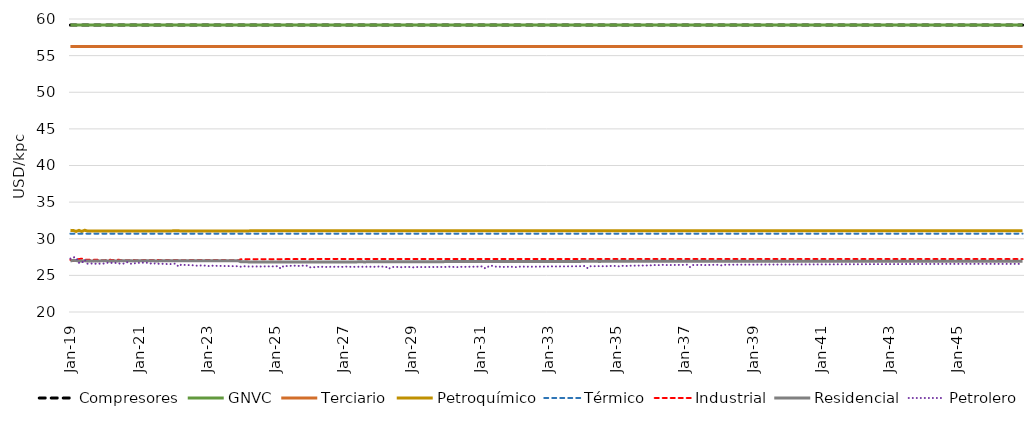
| Category | Compresores | GNVC | Terciario | Petroquímico | Térmico | Industrial | Residencial | Petrolero |
|---|---|---|---|---|---|---|---|---|
| 2019-01-01 | 59.17 | 59.17 | 56.248 | 31.146 | 30.695 | 27.109 | 26.962 | 27.287 |
| 2019-02-01 | 59.17 | 59.17 | 56.248 | 31.127 | 30.695 | 26.976 | 27.054 | 27.488 |
| 2019-03-01 | 59.17 | 59.17 | 56.248 | 31.003 | 30.695 | 27.119 | 27.032 | 27.428 |
| 2019-04-01 | 59.17 | 59.17 | 56.248 | 31.146 | 30.695 | 27.227 | 26.945 | 26.718 |
| 2019-05-01 | 59.17 | 59.17 | 56.248 | 30.996 | 30.695 | 27.282 | 26.962 | 26.695 |
| 2019-06-01 | 59.17 | 59.17 | 56.248 | 31.163 | 30.695 | 27.152 | 26.989 | 27.141 |
| 2019-07-01 | 59.17 | 59.17 | 56.248 | 31.062 | 30.695 | 27.127 | 26.961 | 26.597 |
| 2019-08-01 | 59.17 | 59.17 | 56.248 | 31.062 | 30.695 | 27.127 | 26.961 | 26.595 |
| 2019-09-01 | 59.17 | 59.17 | 56.248 | 31.062 | 30.695 | 27.127 | 26.961 | 26.641 |
| 2019-10-01 | 59.17 | 59.17 | 56.248 | 31.062 | 30.695 | 27.121 | 26.965 | 26.577 |
| 2019-11-01 | 59.17 | 59.17 | 56.248 | 31.062 | 30.695 | 27.124 | 26.963 | 26.599 |
| 2019-12-01 | 59.17 | 59.17 | 56.248 | 31.062 | 30.695 | 27.072 | 26.991 | 26.592 |
| 2020-01-01 | 59.17 | 59.17 | 56.248 | 31.062 | 30.695 | 27.078 | 26.988 | 26.64 |
| 2020-02-01 | 59.17 | 59.17 | 56.248 | 31.062 | 30.695 | 27.1 | 26.978 | 26.725 |
| 2020-03-01 | 59.17 | 59.17 | 56.248 | 31.062 | 30.695 | 27.127 | 26.961 | 26.698 |
| 2020-04-01 | 59.17 | 59.17 | 56.248 | 31.062 | 30.695 | 27.09 | 26.981 | 26.703 |
| 2020-05-01 | 59.17 | 59.17 | 56.248 | 31.062 | 30.695 | 27.121 | 26.964 | 26.69 |
| 2020-06-01 | 59.17 | 59.17 | 56.248 | 31.062 | 30.695 | 27.127 | 26.961 | 26.617 |
| 2020-07-01 | 59.17 | 59.17 | 56.248 | 31.062 | 30.695 | 27.076 | 27.005 | 26.605 |
| 2020-08-01 | 59.17 | 59.17 | 56.248 | 31.062 | 30.695 | 27.076 | 27.004 | 26.614 |
| 2020-09-01 | 59.17 | 59.17 | 56.248 | 31.062 | 30.695 | 27.064 | 27.006 | 26.788 |
| 2020-10-01 | 59.17 | 59.17 | 56.248 | 31.062 | 30.695 | 27.064 | 27.003 | 26.6 |
| 2020-11-01 | 59.17 | 59.17 | 56.248 | 31.062 | 30.695 | 27.101 | 26.975 | 26.574 |
| 2020-12-01 | 59.17 | 59.17 | 56.248 | 31.062 | 30.695 | 27.076 | 27.003 | 26.685 |
| 2021-01-01 | 59.17 | 59.17 | 56.248 | 31.062 | 30.695 | 27.079 | 26.992 | 26.707 |
| 2021-02-01 | 59.17 | 59.17 | 56.248 | 31.062 | 30.695 | 27.077 | 26.993 | 26.742 |
| 2021-03-01 | 59.17 | 59.17 | 56.248 | 31.062 | 30.695 | 27.089 | 26.985 | 26.734 |
| 2021-04-01 | 59.17 | 59.17 | 56.248 | 31.062 | 30.695 | 27.085 | 26.988 | 26.724 |
| 2021-05-01 | 59.17 | 59.17 | 56.248 | 31.062 | 30.695 | 27.087 | 26.987 | 26.598 |
| 2021-06-01 | 59.17 | 59.17 | 56.248 | 31.062 | 30.695 | 27.082 | 26.99 | 26.704 |
| 2021-07-01 | 59.17 | 59.17 | 56.248 | 31.062 | 30.695 | 27.101 | 26.978 | 26.591 |
| 2021-08-01 | 59.17 | 59.17 | 56.248 | 31.062 | 30.695 | 27.102 | 26.977 | 26.585 |
| 2021-09-01 | 59.17 | 59.17 | 56.248 | 31.062 | 30.695 | 27.078 | 26.992 | 26.572 |
| 2021-10-01 | 59.17 | 59.17 | 56.248 | 31.064 | 30.695 | 27.071 | 27.004 | 26.595 |
| 2021-11-01 | 59.17 | 59.17 | 56.248 | 31.062 | 30.695 | 27.087 | 26.986 | 26.539 |
| 2021-12-01 | 59.17 | 59.17 | 56.248 | 31.062 | 30.695 | 27.078 | 26.992 | 26.533 |
| 2022-01-01 | 59.17 | 59.17 | 56.248 | 31.078 | 30.695 | 27.088 | 26.987 | 26.587 |
| 2022-02-01 | 59.17 | 59.17 | 56.248 | 31.076 | 30.695 | 27.085 | 26.99 | 26.612 |
| 2022-03-01 | 59.17 | 59.17 | 56.248 | 31.078 | 30.695 | 27.089 | 26.986 | 26.198 |
| 2022-04-01 | 59.17 | 59.17 | 56.248 | 31.069 | 30.695 | 27.077 | 26.998 | 26.482 |
| 2022-05-01 | 59.17 | 59.17 | 56.248 | 31.062 | 30.695 | 27.064 | 27.009 | 26.43 |
| 2022-06-01 | 59.17 | 59.17 | 56.248 | 31.062 | 30.695 | 27.065 | 27.008 | 26.409 |
| 2022-07-01 | 59.17 | 59.17 | 56.248 | 31.062 | 30.695 | 27.091 | 26.986 | 26.398 |
| 2022-08-01 | 59.17 | 59.17 | 56.248 | 31.062 | 30.695 | 27.091 | 26.987 | 26.378 |
| 2022-09-01 | 59.17 | 59.17 | 56.248 | 31.062 | 30.695 | 27.089 | 26.987 | 26.315 |
| 2022-10-01 | 59.17 | 59.17 | 56.248 | 31.062 | 30.695 | 27.091 | 26.987 | 26.339 |
| 2022-11-01 | 59.17 | 59.17 | 56.248 | 31.062 | 30.695 | 27.09 | 26.988 | 26.353 |
| 2022-12-01 | 59.17 | 59.17 | 56.248 | 31.062 | 30.695 | 27.091 | 26.987 | 26.337 |
| 2023-01-01 | 59.17 | 59.17 | 56.248 | 31.062 | 30.695 | 27.091 | 26.987 | 26.338 |
| 2023-02-01 | 59.17 | 59.17 | 56.248 | 31.062 | 30.695 | 27.09 | 26.988 | 26.239 |
| 2023-03-01 | 59.17 | 59.17 | 56.248 | 31.062 | 30.695 | 27.091 | 26.987 | 26.317 |
| 2023-04-01 | 59.17 | 59.17 | 56.248 | 31.062 | 30.695 | 27.09 | 26.988 | 26.304 |
| 2023-05-01 | 59.17 | 59.17 | 56.248 | 31.062 | 30.695 | 27.09 | 26.988 | 26.302 |
| 2023-06-01 | 59.17 | 59.17 | 56.248 | 31.062 | 30.695 | 27.084 | 26.997 | 26.29 |
| 2023-07-01 | 59.17 | 59.17 | 56.248 | 31.062 | 30.695 | 27.09 | 26.99 | 26.276 |
| 2023-08-01 | 59.17 | 59.17 | 56.248 | 31.062 | 30.695 | 27.076 | 27.002 | 26.277 |
| 2023-09-01 | 59.17 | 59.17 | 56.248 | 31.062 | 30.695 | 27.065 | 27.008 | 26.27 |
| 2023-10-01 | 59.17 | 59.17 | 56.248 | 31.062 | 30.695 | 27.065 | 27.008 | 26.26 |
| 2023-11-01 | 59.17 | 59.17 | 56.248 | 31.062 | 30.695 | 27.068 | 27.007 | 26.249 |
| 2023-12-01 | 59.17 | 59.17 | 56.248 | 31.062 | 30.695 | 27.067 | 27.007 | 26.253 |
| 2024-01-01 | 59.17 | 59.17 | 56.248 | 31.067 | 30.695 | 27.197 | 26.848 | 26.181 |
| 2024-02-01 | 59.17 | 59.17 | 56.248 | 31.072 | 30.695 | 27.203 | 26.843 | 26.26 |
| 2024-03-01 | 59.17 | 59.17 | 56.248 | 31.07 | 30.695 | 27.199 | 26.846 | 26.204 |
| 2024-04-01 | 59.17 | 59.17 | 56.248 | 31.075 | 30.695 | 27.207 | 26.838 | 26.214 |
| 2024-05-01 | 59.17 | 59.17 | 56.248 | 31.076 | 30.695 | 27.208 | 26.837 | 26.215 |
| 2024-06-01 | 59.17 | 59.17 | 56.248 | 31.077 | 30.695 | 27.209 | 26.835 | 26.214 |
| 2024-07-01 | 59.17 | 59.17 | 56.248 | 31.082 | 30.695 | 27.214 | 26.83 | 26.223 |
| 2024-08-01 | 59.17 | 59.17 | 56.248 | 31.081 | 30.695 | 27.214 | 26.831 | 26.211 |
| 2024-09-01 | 59.17 | 59.17 | 56.248 | 31.085 | 30.695 | 27.217 | 26.827 | 26.225 |
| 2024-10-01 | 59.17 | 59.17 | 56.248 | 31.086 | 30.695 | 27.217 | 26.826 | 26.227 |
| 2024-11-01 | 59.17 | 59.17 | 56.248 | 31.086 | 30.695 | 27.218 | 26.825 | 26.23 |
| 2024-12-01 | 59.17 | 59.17 | 56.248 | 31.086 | 30.695 | 27.218 | 26.826 | 26.232 |
| 2025-01-01 | 59.17 | 59.17 | 56.248 | 31.086 | 30.695 | 27.202 | 26.829 | 26.217 |
| 2025-02-01 | 59.17 | 59.17 | 56.248 | 31.087 | 30.695 | 27.216 | 26.822 | 26.267 |
| 2025-03-01 | 59.17 | 59.17 | 56.248 | 31.087 | 30.695 | 27.216 | 26.823 | 25.92 |
| 2025-04-01 | 59.17 | 59.17 | 56.248 | 31.088 | 30.695 | 27.218 | 26.822 | 26.3 |
| 2025-05-01 | 59.17 | 59.17 | 56.248 | 31.09 | 30.695 | 27.22 | 26.823 | 26.272 |
| 2025-06-01 | 59.17 | 59.17 | 56.248 | 31.09 | 30.695 | 27.22 | 26.82 | 26.296 |
| 2025-07-01 | 59.17 | 59.17 | 56.248 | 31.091 | 30.695 | 27.221 | 26.822 | 26.31 |
| 2025-08-01 | 59.17 | 59.17 | 56.248 | 31.092 | 30.695 | 27.221 | 26.821 | 26.322 |
| 2025-09-01 | 59.17 | 59.17 | 56.248 | 31.092 | 30.695 | 27.225 | 26.821 | 26.275 |
| 2025-10-01 | 59.17 | 59.17 | 56.248 | 31.092 | 30.695 | 27.226 | 26.82 | 26.324 |
| 2025-11-01 | 59.17 | 59.17 | 56.248 | 31.092 | 30.695 | 27.228 | 26.821 | 26.327 |
| 2025-12-01 | 59.17 | 59.17 | 56.248 | 31.093 | 30.695 | 27.228 | 26.822 | 26.349 |
| 2026-01-01 | 59.17 | 59.17 | 56.248 | 31.09 | 30.695 | 27.202 | 26.838 | 26.111 |
| 2026-02-01 | 59.17 | 59.17 | 56.248 | 31.09 | 30.695 | 27.233 | 26.817 | 26.083 |
| 2026-03-01 | 59.17 | 59.17 | 56.248 | 31.09 | 30.695 | 27.233 | 26.818 | 26.132 |
| 2026-04-01 | 59.17 | 59.17 | 56.248 | 31.091 | 30.695 | 27.235 | 26.819 | 26.149 |
| 2026-05-01 | 59.17 | 59.17 | 56.248 | 31.09 | 30.695 | 27.236 | 26.818 | 26.208 |
| 2026-06-01 | 59.17 | 59.17 | 56.248 | 31.09 | 30.695 | 27.239 | 26.816 | 26.156 |
| 2026-07-01 | 59.17 | 59.17 | 56.248 | 31.091 | 30.695 | 27.238 | 26.819 | 26.149 |
| 2026-08-01 | 59.17 | 59.17 | 56.248 | 31.091 | 30.695 | 27.24 | 26.818 | 26.159 |
| 2026-09-01 | 59.17 | 59.17 | 56.248 | 31.091 | 30.695 | 27.243 | 26.817 | 26.173 |
| 2026-10-01 | 59.17 | 59.17 | 56.248 | 31.091 | 30.695 | 27.243 | 26.817 | 26.169 |
| 2026-11-01 | 59.17 | 59.17 | 56.248 | 31.091 | 30.695 | 27.246 | 26.815 | 26.175 |
| 2026-12-01 | 59.17 | 59.17 | 56.248 | 31.091 | 30.695 | 27.245 | 26.816 | 26.173 |
| 2027-01-01 | 59.17 | 59.17 | 56.248 | 31.09 | 30.695 | 27.223 | 26.838 | 26.155 |
| 2027-02-01 | 59.17 | 59.17 | 56.248 | 31.09 | 30.695 | 27.227 | 26.837 | 26.197 |
| 2027-03-01 | 59.17 | 59.17 | 56.248 | 31.09 | 30.695 | 27.225 | 26.837 | 26.159 |
| 2027-04-01 | 59.17 | 59.17 | 56.248 | 31.089 | 30.695 | 27.228 | 26.838 | 26.171 |
| 2027-05-01 | 59.17 | 59.17 | 56.248 | 31.09 | 30.695 | 27.23 | 26.837 | 26.169 |
| 2027-06-01 | 59.17 | 59.17 | 56.248 | 31.085 | 30.695 | 27.224 | 26.843 | 26.18 |
| 2027-07-01 | 59.17 | 59.17 | 56.248 | 31.085 | 30.695 | 27.222 | 26.843 | 26.167 |
| 2027-08-01 | 59.17 | 59.17 | 56.248 | 31.085 | 30.695 | 27.224 | 26.843 | 26.177 |
| 2027-09-01 | 59.17 | 59.17 | 56.248 | 31.085 | 30.695 | 27.227 | 26.843 | 26.182 |
| 2027-10-01 | 59.17 | 59.17 | 56.248 | 31.085 | 30.695 | 27.227 | 26.86 | 26.181 |
| 2027-11-01 | 59.17 | 59.17 | 56.248 | 31.085 | 30.695 | 27.227 | 26.862 | 26.173 |
| 2027-12-01 | 59.17 | 59.17 | 56.248 | 31.085 | 30.695 | 27.227 | 26.861 | 26.17 |
| 2028-01-01 | 59.17 | 59.17 | 56.248 | 31.091 | 30.695 | 27.235 | 26.856 | 26.178 |
| 2028-02-01 | 59.17 | 59.17 | 56.248 | 31.091 | 30.695 | 27.233 | 26.858 | 26.236 |
| 2028-03-01 | 59.17 | 59.17 | 56.248 | 31.091 | 30.695 | 27.23 | 26.855 | 26.185 |
| 2028-04-01 | 59.17 | 59.17 | 56.248 | 31.091 | 30.695 | 27.234 | 26.846 | 26.18 |
| 2028-05-01 | 59.17 | 59.17 | 56.248 | 31.091 | 30.695 | 27.233 | 26.843 | 25.894 |
| 2028-06-01 | 59.17 | 59.17 | 56.248 | 31.091 | 30.695 | 27.232 | 26.846 | 26.152 |
| 2028-07-01 | 59.17 | 59.17 | 56.248 | 31.091 | 30.695 | 27.231 | 26.86 | 26.15 |
| 2028-08-01 | 59.17 | 59.17 | 56.248 | 31.091 | 30.695 | 27.23 | 26.861 | 26.144 |
| 2028-09-01 | 59.17 | 59.17 | 56.248 | 31.091 | 30.695 | 27.23 | 26.863 | 26.1 |
| 2028-10-01 | 59.17 | 59.17 | 56.248 | 31.091 | 30.695 | 27.23 | 26.863 | 26.151 |
| 2028-11-01 | 59.17 | 59.17 | 56.248 | 31.091 | 30.695 | 27.23 | 26.865 | 26.148 |
| 2028-12-01 | 59.17 | 59.17 | 56.248 | 31.091 | 30.695 | 27.23 | 26.864 | 26.147 |
| 2029-01-01 | 59.17 | 59.17 | 56.248 | 31.091 | 30.695 | 27.231 | 26.866 | 26.139 |
| 2029-02-01 | 59.17 | 59.17 | 56.248 | 31.091 | 30.695 | 27.229 | 26.87 | 26.073 |
| 2029-03-01 | 59.17 | 59.17 | 56.248 | 31.091 | 30.695 | 27.229 | 26.869 | 26.138 |
| 2029-04-01 | 59.17 | 59.17 | 56.248 | 31.091 | 30.695 | 27.229 | 26.871 | 26.138 |
| 2029-05-01 | 59.17 | 59.17 | 56.248 | 31.091 | 30.695 | 27.229 | 26.87 | 26.142 |
| 2029-06-01 | 59.17 | 59.17 | 56.248 | 31.091 | 30.695 | 27.229 | 26.873 | 26.143 |
| 2029-07-01 | 59.17 | 59.17 | 56.248 | 31.091 | 30.695 | 27.229 | 26.873 | 26.143 |
| 2029-08-01 | 59.17 | 59.17 | 56.248 | 31.091 | 30.695 | 27.229 | 26.872 | 26.142 |
| 2029-09-01 | 59.17 | 59.17 | 56.248 | 31.091 | 30.695 | 27.229 | 26.875 | 26.146 |
| 2029-10-01 | 59.17 | 59.17 | 56.248 | 31.091 | 30.695 | 27.229 | 26.875 | 26.147 |
| 2029-11-01 | 59.17 | 59.17 | 56.248 | 31.091 | 30.695 | 27.228 | 26.876 | 26.147 |
| 2029-12-01 | 59.17 | 59.17 | 56.248 | 31.091 | 30.695 | 27.228 | 26.876 | 26.15 |
| 2030-01-01 | 59.17 | 59.17 | 56.248 | 31.091 | 30.695 | 27.229 | 26.878 | 26.15 |
| 2030-02-01 | 59.17 | 59.17 | 56.248 | 31.091 | 30.695 | 27.228 | 26.88 | 26.192 |
| 2030-03-01 | 59.17 | 59.17 | 56.248 | 31.091 | 30.695 | 27.228 | 26.882 | 26.156 |
| 2030-04-01 | 59.17 | 59.17 | 56.248 | 31.091 | 30.695 | 27.228 | 26.881 | 26.159 |
| 2030-05-01 | 59.17 | 59.17 | 56.248 | 31.091 | 30.695 | 27.228 | 26.881 | 26.122 |
| 2030-06-01 | 59.17 | 59.17 | 56.248 | 31.091 | 30.695 | 27.228 | 26.884 | 26.165 |
| 2030-07-01 | 59.17 | 59.17 | 56.248 | 31.091 | 30.695 | 27.228 | 26.883 | 26.165 |
| 2030-08-01 | 59.17 | 59.17 | 56.248 | 31.091 | 30.695 | 27.227 | 26.884 | 26.168 |
| 2030-09-01 | 59.17 | 59.17 | 56.248 | 31.091 | 30.695 | 27.228 | 26.884 | 26.171 |
| 2030-10-01 | 59.17 | 59.17 | 56.248 | 31.091 | 30.695 | 27.227 | 26.885 | 26.177 |
| 2030-11-01 | 59.17 | 59.17 | 56.248 | 31.091 | 30.695 | 27.227 | 26.887 | 26.186 |
| 2030-12-01 | 59.17 | 59.17 | 56.248 | 31.091 | 30.695 | 27.227 | 26.886 | 26.188 |
| 2031-01-01 | 59.17 | 59.17 | 56.248 | 31.091 | 30.695 | 27.228 | 26.894 | 26.201 |
| 2031-02-01 | 59.17 | 59.17 | 56.248 | 31.091 | 30.695 | 27.228 | 26.889 | 26.236 |
| 2031-03-01 | 59.17 | 59.17 | 56.248 | 31.091 | 30.695 | 27.228 | 26.893 | 25.937 |
| 2031-04-01 | 59.17 | 59.17 | 56.248 | 31.09 | 30.695 | 27.227 | 26.893 | 26.196 |
| 2031-05-01 | 59.17 | 59.17 | 56.248 | 31.091 | 30.695 | 27.227 | 26.89 | 26.342 |
| 2031-06-01 | 59.17 | 59.17 | 56.248 | 31.091 | 30.695 | 27.227 | 26.889 | 26.204 |
| 2031-07-01 | 59.17 | 59.17 | 56.248 | 31.091 | 30.695 | 27.227 | 26.888 | 26.189 |
| 2031-08-01 | 59.17 | 59.17 | 56.248 | 31.091 | 30.695 | 27.227 | 26.889 | 26.188 |
| 2031-09-01 | 59.17 | 59.17 | 56.248 | 31.091 | 30.695 | 27.227 | 26.891 | 26.135 |
| 2031-10-01 | 59.17 | 59.17 | 56.248 | 31.091 | 30.695 | 27.227 | 26.89 | 26.181 |
| 2031-11-01 | 59.17 | 59.17 | 56.248 | 31.091 | 30.695 | 27.227 | 26.894 | 26.179 |
| 2031-12-01 | 59.17 | 59.17 | 56.248 | 31.091 | 30.695 | 27.226 | 26.894 | 26.179 |
| 2032-01-01 | 59.17 | 59.17 | 56.248 | 31.091 | 30.695 | 27.227 | 26.893 | 26.175 |
| 2032-02-01 | 59.17 | 59.17 | 56.248 | 31.091 | 30.695 | 27.227 | 26.894 | 26.113 |
| 2032-03-01 | 59.17 | 59.17 | 56.248 | 31.091 | 30.695 | 27.226 | 26.895 | 26.196 |
| 2032-04-01 | 59.17 | 59.17 | 56.248 | 31.091 | 30.695 | 27.226 | 26.897 | 26.197 |
| 2032-05-01 | 59.17 | 59.17 | 56.248 | 31.091 | 30.695 | 27.226 | 26.896 | 26.195 |
| 2032-06-01 | 59.17 | 59.17 | 56.248 | 31.091 | 30.695 | 27.226 | 26.897 | 26.192 |
| 2032-07-01 | 59.17 | 59.17 | 56.248 | 31.091 | 30.695 | 27.226 | 26.897 | 26.189 |
| 2032-08-01 | 59.17 | 59.17 | 56.248 | 31.091 | 30.695 | 27.226 | 26.898 | 26.189 |
| 2032-09-01 | 59.17 | 59.17 | 56.248 | 31.091 | 30.695 | 27.226 | 26.899 | 26.193 |
| 2032-10-01 | 59.17 | 59.17 | 56.248 | 31.091 | 30.695 | 27.226 | 26.899 | 26.196 |
| 2032-11-01 | 59.17 | 59.17 | 56.248 | 31.091 | 30.695 | 27.226 | 26.901 | 26.201 |
| 2032-12-01 | 59.17 | 59.17 | 56.248 | 31.091 | 30.695 | 27.226 | 26.9 | 26.204 |
| 2033-01-01 | 59.17 | 59.17 | 56.248 | 31.091 | 30.695 | 27.226 | 26.9 | 26.207 |
| 2033-02-01 | 59.17 | 59.17 | 56.248 | 31.09 | 30.695 | 27.225 | 26.902 | 26.246 |
| 2033-03-01 | 59.17 | 59.17 | 56.248 | 31.091 | 30.695 | 27.226 | 26.902 | 26.213 |
| 2033-04-01 | 59.17 | 59.17 | 56.248 | 31.091 | 30.695 | 27.226 | 26.901 | 26.218 |
| 2033-05-01 | 59.17 | 59.17 | 56.248 | 31.091 | 30.695 | 27.226 | 26.903 | 26.223 |
| 2033-06-01 | 59.17 | 59.17 | 56.248 | 31.091 | 30.695 | 27.226 | 26.903 | 26.226 |
| 2033-07-01 | 59.17 | 59.17 | 56.248 | 31.091 | 30.695 | 27.226 | 26.902 | 26.229 |
| 2033-08-01 | 59.17 | 59.17 | 56.248 | 31.091 | 30.695 | 27.226 | 26.903 | 26.233 |
| 2033-09-01 | 59.17 | 59.17 | 56.248 | 31.091 | 30.695 | 27.225 | 26.905 | 26.237 |
| 2033-10-01 | 59.17 | 59.17 | 56.248 | 31.09 | 30.695 | 27.225 | 26.906 | 26.241 |
| 2033-11-01 | 59.17 | 59.17 | 56.248 | 31.091 | 30.695 | 27.225 | 26.906 | 26.244 |
| 2033-12-01 | 59.17 | 59.17 | 56.248 | 31.091 | 30.695 | 27.225 | 26.905 | 26.249 |
| 2034-01-01 | 59.17 | 59.17 | 56.248 | 31.091 | 30.695 | 27.224 | 26.914 | 26.255 |
| 2034-02-01 | 59.17 | 59.17 | 56.248 | 31.091 | 30.695 | 27.224 | 26.914 | 26.296 |
| 2034-03-01 | 59.17 | 59.17 | 56.248 | 31.091 | 30.695 | 27.224 | 26.914 | 25.971 |
| 2034-04-01 | 59.17 | 59.17 | 56.248 | 31.091 | 30.695 | 27.224 | 26.913 | 26.244 |
| 2034-05-01 | 59.17 | 59.17 | 56.248 | 31.091 | 30.695 | 27.225 | 26.913 | 26.25 |
| 2034-06-01 | 59.17 | 59.17 | 56.248 | 31.091 | 30.695 | 27.224 | 26.913 | 26.255 |
| 2034-07-01 | 59.17 | 59.17 | 56.248 | 31.091 | 30.695 | 27.225 | 26.91 | 26.259 |
| 2034-08-01 | 59.17 | 59.17 | 56.248 | 31.091 | 30.695 | 27.225 | 26.912 | 26.265 |
| 2034-09-01 | 59.17 | 59.17 | 56.248 | 31.091 | 30.695 | 27.225 | 26.913 | 26.22 |
| 2034-10-01 | 59.17 | 59.17 | 56.248 | 31.091 | 30.695 | 27.225 | 26.913 | 26.276 |
| 2034-11-01 | 59.17 | 59.17 | 56.248 | 31.091 | 30.695 | 27.225 | 26.913 | 26.281 |
| 2034-12-01 | 59.17 | 59.17 | 56.248 | 31.091 | 30.695 | 27.225 | 26.913 | 26.288 |
| 2035-01-01 | 59.17 | 59.17 | 56.248 | 31.091 | 30.695 | 27.224 | 26.914 | 26.293 |
| 2035-02-01 | 59.17 | 59.17 | 56.248 | 31.091 | 30.695 | 27.224 | 26.914 | 26.23 |
| 2035-03-01 | 59.17 | 59.17 | 56.248 | 31.091 | 30.695 | 27.224 | 26.914 | 26.303 |
| 2035-04-01 | 59.17 | 59.17 | 56.248 | 31.091 | 30.695 | 27.224 | 26.913 | 26.309 |
| 2035-05-01 | 59.17 | 59.17 | 56.248 | 31.091 | 30.695 | 27.224 | 26.914 | 26.276 |
| 2035-06-01 | 59.17 | 59.17 | 56.248 | 31.091 | 30.695 | 27.224 | 26.913 | 26.321 |
| 2035-07-01 | 59.17 | 59.17 | 56.248 | 31.091 | 30.695 | 27.225 | 26.913 | 26.325 |
| 2035-08-01 | 59.17 | 59.17 | 56.248 | 31.091 | 30.695 | 27.224 | 26.913 | 26.331 |
| 2035-09-01 | 59.17 | 59.17 | 56.248 | 31.091 | 30.695 | 27.224 | 26.913 | 26.336 |
| 2035-10-01 | 59.17 | 59.17 | 56.248 | 31.091 | 30.695 | 27.224 | 26.913 | 26.34 |
| 2035-11-01 | 59.17 | 59.17 | 56.248 | 31.091 | 30.695 | 27.224 | 26.913 | 26.346 |
| 2035-12-01 | 59.17 | 59.17 | 56.248 | 31.091 | 30.695 | 27.224 | 26.913 | 26.35 |
| 2036-01-01 | 59.17 | 59.17 | 56.248 | 31.091 | 30.695 | 27.224 | 26.914 | 26.353 |
| 2036-02-01 | 59.17 | 59.17 | 56.248 | 31.091 | 30.695 | 27.224 | 26.914 | 26.429 |
| 2036-03-01 | 59.17 | 59.17 | 56.248 | 31.091 | 30.695 | 27.224 | 26.914 | 26.391 |
| 2036-04-01 | 59.17 | 59.17 | 56.248 | 31.091 | 30.695 | 27.224 | 26.914 | 26.397 |
| 2036-05-01 | 59.17 | 59.17 | 56.248 | 31.091 | 30.695 | 27.224 | 26.914 | 26.445 |
| 2036-06-01 | 59.17 | 59.17 | 56.248 | 31.091 | 30.695 | 27.224 | 26.913 | 26.421 |
| 2036-07-01 | 59.17 | 59.17 | 56.248 | 31.091 | 30.695 | 27.224 | 26.913 | 26.408 |
| 2036-08-01 | 59.17 | 59.17 | 56.248 | 31.091 | 30.695 | 27.224 | 26.913 | 26.412 |
| 2036-09-01 | 59.17 | 59.17 | 56.248 | 31.091 | 30.695 | 27.224 | 26.913 | 26.417 |
| 2036-10-01 | 59.17 | 59.17 | 56.248 | 31.091 | 30.695 | 27.224 | 26.913 | 26.421 |
| 2036-11-01 | 59.17 | 59.17 | 56.248 | 31.091 | 30.695 | 27.224 | 26.913 | 26.426 |
| 2036-12-01 | 59.17 | 59.17 | 56.248 | 31.091 | 30.695 | 27.224 | 26.913 | 26.43 |
| 2037-01-01 | 59.17 | 59.17 | 56.248 | 31.091 | 30.695 | 27.223 | 26.915 | 26.43 |
| 2037-02-01 | 59.17 | 59.17 | 56.248 | 31.091 | 30.695 | 27.223 | 26.914 | 26.472 |
| 2037-03-01 | 59.17 | 59.17 | 56.248 | 31.091 | 30.695 | 27.223 | 26.914 | 26.127 |
| 2037-04-01 | 59.17 | 59.17 | 56.248 | 31.091 | 30.695 | 27.223 | 26.914 | 26.414 |
| 2037-05-01 | 59.17 | 59.17 | 56.248 | 31.091 | 30.695 | 27.224 | 26.914 | 26.418 |
| 2037-06-01 | 59.17 | 59.17 | 56.248 | 31.091 | 30.695 | 27.224 | 26.914 | 26.422 |
| 2037-07-01 | 59.17 | 59.17 | 56.248 | 31.091 | 30.695 | 27.224 | 26.913 | 26.427 |
| 2037-08-01 | 59.17 | 59.17 | 56.248 | 31.091 | 30.695 | 27.224 | 26.913 | 26.43 |
| 2037-09-01 | 59.17 | 59.17 | 56.248 | 31.091 | 30.695 | 27.224 | 26.913 | 26.38 |
| 2037-10-01 | 59.17 | 59.17 | 56.248 | 31.091 | 30.695 | 27.224 | 26.914 | 26.436 |
| 2037-11-01 | 59.17 | 59.17 | 56.248 | 31.091 | 30.695 | 27.224 | 26.913 | 26.44 |
| 2037-12-01 | 59.17 | 59.17 | 56.248 | 31.091 | 30.695 | 27.224 | 26.913 | 26.443 |
| 2038-01-01 | 59.17 | 59.17 | 56.248 | 31.091 | 30.695 | 27.223 | 26.915 | 26.442 |
| 2038-02-01 | 59.17 | 59.17 | 56.248 | 31.091 | 30.695 | 27.223 | 26.915 | 26.374 |
| 2038-03-01 | 59.17 | 59.17 | 56.248 | 31.091 | 30.695 | 27.223 | 26.915 | 26.448 |
| 2038-04-01 | 59.17 | 59.17 | 56.248 | 31.091 | 30.695 | 27.223 | 26.914 | 26.451 |
| 2038-05-01 | 59.17 | 59.17 | 56.248 | 31.091 | 30.695 | 27.223 | 26.914 | 26.454 |
| 2038-06-01 | 59.17 | 59.17 | 56.248 | 31.091 | 30.695 | 27.223 | 26.914 | 26.456 |
| 2038-07-01 | 59.17 | 59.17 | 56.248 | 31.091 | 30.695 | 27.224 | 26.914 | 26.46 |
| 2038-08-01 | 59.17 | 59.17 | 56.248 | 31.091 | 30.695 | 27.224 | 26.914 | 26.461 |
| 2038-09-01 | 59.17 | 59.17 | 56.248 | 31.091 | 30.695 | 27.223 | 26.914 | 26.462 |
| 2038-10-01 | 59.17 | 59.17 | 56.248 | 31.091 | 30.695 | 27.223 | 26.914 | 26.463 |
| 2038-11-01 | 59.17 | 59.17 | 56.248 | 31.091 | 30.695 | 27.223 | 26.914 | 26.465 |
| 2038-12-01 | 59.17 | 59.17 | 56.248 | 31.091 | 30.695 | 27.223 | 26.914 | 26.468 |
| 2039-01-01 | 59.17 | 59.17 | 56.248 | 31.091 | 30.695 | 27.223 | 26.915 | 26.466 |
| 2039-02-01 | 59.17 | 59.17 | 56.248 | 31.091 | 30.695 | 27.223 | 26.915 | 26.469 |
| 2039-03-01 | 59.17 | 59.17 | 56.248 | 31.091 | 30.695 | 27.223 | 26.915 | 26.471 |
| 2039-04-01 | 59.17 | 59.17 | 56.248 | 31.091 | 30.695 | 27.223 | 26.915 | 26.473 |
| 2039-05-01 | 59.17 | 59.17 | 56.248 | 31.091 | 30.695 | 27.223 | 26.915 | 26.475 |
| 2039-06-01 | 59.17 | 59.17 | 56.248 | 31.091 | 30.695 | 27.223 | 26.915 | 26.476 |
| 2039-07-01 | 59.17 | 59.17 | 56.248 | 31.091 | 30.695 | 27.223 | 26.914 | 26.48 |
| 2039-08-01 | 59.17 | 59.17 | 56.248 | 31.091 | 30.695 | 27.223 | 26.914 | 26.481 |
| 2039-09-01 | 59.17 | 59.17 | 56.248 | 31.091 | 30.695 | 27.223 | 26.914 | 26.482 |
| 2039-10-01 | 59.17 | 59.17 | 56.248 | 31.091 | 30.695 | 27.223 | 26.914 | 26.483 |
| 2039-11-01 | 59.17 | 59.17 | 56.248 | 31.091 | 30.695 | 27.223 | 26.914 | 26.484 |
| 2039-12-01 | 59.17 | 59.17 | 56.248 | 31.091 | 30.695 | 27.223 | 26.914 | 26.486 |
| 2040-01-01 | 59.17 | 59.17 | 56.248 | 31.09 | 30.695 | 27.222 | 26.916 | 26.484 |
| 2040-02-01 | 59.17 | 59.17 | 56.248 | 31.09 | 30.695 | 27.222 | 26.916 | 26.486 |
| 2040-03-01 | 59.17 | 59.17 | 56.248 | 31.09 | 30.695 | 27.222 | 26.916 | 26.487 |
| 2040-04-01 | 59.17 | 59.17 | 56.248 | 31.09 | 30.695 | 27.223 | 26.916 | 26.489 |
| 2040-05-01 | 59.17 | 59.17 | 56.248 | 31.091 | 30.695 | 27.223 | 26.915 | 26.491 |
| 2040-06-01 | 59.17 | 59.17 | 56.248 | 31.09 | 30.695 | 27.223 | 26.916 | 26.492 |
| 2040-07-01 | 59.17 | 59.17 | 56.248 | 31.091 | 30.695 | 27.223 | 26.914 | 26.495 |
| 2040-08-01 | 59.17 | 59.17 | 56.248 | 31.091 | 30.695 | 27.223 | 26.915 | 26.496 |
| 2040-09-01 | 59.17 | 59.17 | 56.248 | 31.091 | 30.695 | 27.223 | 26.915 | 26.497 |
| 2040-10-01 | 59.17 | 59.17 | 56.248 | 31.091 | 30.695 | 27.223 | 26.915 | 26.498 |
| 2040-11-01 | 59.17 | 59.17 | 56.248 | 31.091 | 30.695 | 27.223 | 26.915 | 26.499 |
| 2040-12-01 | 59.17 | 59.17 | 56.248 | 31.091 | 30.695 | 27.223 | 26.915 | 26.501 |
| 2041-01-01 | 59.17 | 59.17 | 56.248 | 31.09 | 30.695 | 27.222 | 26.917 | 26.499 |
| 2041-02-01 | 59.17 | 59.17 | 56.248 | 31.09 | 30.695 | 27.222 | 26.917 | 26.501 |
| 2041-03-01 | 59.17 | 59.17 | 56.248 | 31.09 | 30.695 | 27.222 | 26.916 | 26.501 |
| 2041-04-01 | 59.17 | 59.17 | 56.248 | 31.09 | 30.695 | 27.222 | 26.916 | 26.503 |
| 2041-05-01 | 59.17 | 59.17 | 56.248 | 31.091 | 30.695 | 27.223 | 26.916 | 26.505 |
| 2041-06-01 | 59.17 | 59.17 | 56.248 | 31.09 | 30.695 | 27.222 | 26.916 | 26.508 |
| 2041-07-01 | 59.17 | 59.17 | 56.248 | 31.091 | 30.695 | 27.223 | 26.915 | 26.512 |
| 2041-08-01 | 59.17 | 59.17 | 56.248 | 31.091 | 30.695 | 27.223 | 26.915 | 26.514 |
| 2041-09-01 | 59.17 | 59.17 | 56.248 | 31.091 | 30.695 | 27.223 | 26.915 | 26.516 |
| 2041-10-01 | 59.17 | 59.17 | 56.248 | 31.091 | 30.695 | 27.223 | 26.915 | 26.517 |
| 2041-11-01 | 59.17 | 59.17 | 56.248 | 31.091 | 30.695 | 27.223 | 26.915 | 26.518 |
| 2041-12-01 | 59.17 | 59.17 | 56.248 | 31.091 | 30.695 | 27.223 | 26.915 | 26.52 |
| 2042-01-01 | 59.17 | 59.17 | 56.248 | 31.09 | 30.695 | 27.222 | 26.917 | 26.52 |
| 2042-02-01 | 59.17 | 59.17 | 56.248 | 31.09 | 30.695 | 27.222 | 26.917 | 26.522 |
| 2042-03-01 | 59.17 | 59.17 | 56.248 | 31.09 | 30.695 | 27.222 | 26.917 | 26.524 |
| 2042-04-01 | 59.17 | 59.17 | 56.248 | 31.09 | 30.695 | 27.222 | 26.916 | 26.526 |
| 2042-05-01 | 59.17 | 59.17 | 56.248 | 31.09 | 30.695 | 27.222 | 26.916 | 26.528 |
| 2042-06-01 | 59.17 | 59.17 | 56.248 | 31.09 | 30.695 | 27.222 | 26.916 | 26.529 |
| 2042-07-01 | 59.17 | 59.17 | 56.248 | 31.091 | 30.695 | 27.223 | 26.915 | 26.532 |
| 2042-08-01 | 59.17 | 59.17 | 56.248 | 31.091 | 30.695 | 27.223 | 26.915 | 26.534 |
| 2042-09-01 | 59.17 | 59.17 | 56.248 | 31.091 | 30.695 | 27.223 | 26.916 | 26.535 |
| 2042-10-01 | 59.17 | 59.17 | 56.248 | 31.091 | 30.695 | 27.223 | 26.916 | 26.536 |
| 2042-11-01 | 59.17 | 59.17 | 56.248 | 31.091 | 30.695 | 27.223 | 26.916 | 26.537 |
| 2042-12-01 | 59.17 | 59.17 | 56.248 | 31.091 | 30.695 | 27.223 | 26.916 | 26.539 |
| 2043-01-01 | 59.17 | 59.17 | 56.248 | 31.09 | 30.695 | 27.222 | 26.917 | 26.537 |
| 2043-02-01 | 59.17 | 59.17 | 56.248 | 31.09 | 30.695 | 27.222 | 26.917 | 26.539 |
| 2043-03-01 | 59.17 | 59.17 | 56.248 | 31.09 | 30.695 | 27.222 | 26.917 | 26.54 |
| 2043-04-01 | 59.17 | 59.17 | 56.248 | 31.09 | 30.695 | 27.222 | 26.917 | 26.542 |
| 2043-05-01 | 59.17 | 59.17 | 56.248 | 31.09 | 30.695 | 27.222 | 26.917 | 26.543 |
| 2043-06-01 | 59.17 | 59.17 | 56.248 | 31.09 | 30.695 | 27.222 | 26.917 | 26.545 |
| 2043-07-01 | 59.17 | 59.17 | 56.248 | 31.091 | 30.695 | 27.223 | 26.916 | 26.547 |
| 2043-08-01 | 59.17 | 59.17 | 56.248 | 31.091 | 30.695 | 27.223 | 26.916 | 26.548 |
| 2043-09-01 | 59.17 | 59.17 | 56.248 | 31.091 | 30.695 | 27.222 | 26.916 | 26.549 |
| 2043-10-01 | 59.17 | 59.17 | 56.248 | 31.091 | 30.695 | 27.222 | 26.916 | 26.55 |
| 2043-11-01 | 59.17 | 59.17 | 56.248 | 31.091 | 30.695 | 27.222 | 26.916 | 26.551 |
| 2043-12-01 | 59.17 | 59.17 | 56.248 | 31.091 | 30.695 | 27.222 | 26.916 | 26.553 |
| 2044-01-01 | 59.17 | 59.17 | 56.248 | 31.09 | 30.695 | 27.222 | 26.917 | 26.552 |
| 2044-02-01 | 59.17 | 59.17 | 56.248 | 31.09 | 30.695 | 27.222 | 26.917 | 26.554 |
| 2044-03-01 | 59.17 | 59.17 | 56.248 | 31.09 | 30.695 | 27.222 | 26.917 | 26.555 |
| 2044-04-01 | 59.17 | 59.17 | 56.248 | 31.09 | 30.695 | 27.222 | 26.917 | 26.557 |
| 2044-05-01 | 59.17 | 59.17 | 56.248 | 31.09 | 30.695 | 27.222 | 26.917 | 26.559 |
| 2044-06-01 | 59.17 | 59.17 | 56.248 | 31.09 | 30.695 | 27.222 | 26.917 | 26.56 |
| 2044-07-01 | 59.17 | 59.17 | 56.248 | 31.091 | 30.695 | 27.222 | 26.916 | 26.563 |
| 2044-08-01 | 59.17 | 59.17 | 56.248 | 31.091 | 30.695 | 27.222 | 26.916 | 26.564 |
| 2044-09-01 | 59.17 | 59.17 | 56.248 | 31.091 | 30.695 | 27.222 | 26.916 | 26.565 |
| 2044-10-01 | 59.17 | 59.17 | 56.248 | 31.091 | 30.695 | 27.222 | 26.916 | 26.565 |
| 2044-11-01 | 59.17 | 59.17 | 56.248 | 31.091 | 30.695 | 27.222 | 26.916 | 26.566 |
| 2044-12-01 | 59.17 | 59.17 | 56.248 | 31.091 | 30.695 | 27.222 | 26.916 | 26.567 |
| 2045-01-01 | 59.17 | 59.17 | 56.248 | 31.09 | 30.695 | 27.222 | 26.918 | 26.565 |
| 2045-02-01 | 59.17 | 59.17 | 56.248 | 31.091 | 30.695 | 27.222 | 26.917 | 26.566 |
| 2045-03-01 | 59.17 | 59.17 | 56.248 | 31.09 | 30.695 | 27.222 | 26.917 | 26.567 |
| 2045-04-01 | 59.17 | 59.17 | 56.248 | 31.09 | 30.695 | 27.222 | 26.917 | 26.567 |
| 2045-05-01 | 59.17 | 59.17 | 56.248 | 31.09 | 30.695 | 27.222 | 26.917 | 26.568 |
| 2045-06-01 | 59.17 | 59.17 | 56.248 | 31.09 | 30.695 | 27.222 | 26.917 | 26.568 |
| 2045-07-01 | 59.17 | 59.17 | 56.248 | 31.091 | 30.695 | 27.222 | 26.916 | 26.569 |
| 2045-08-01 | 59.17 | 59.17 | 56.248 | 31.091 | 30.695 | 27.222 | 26.916 | 26.569 |
| 2045-09-01 | 59.17 | 59.17 | 56.248 | 31.091 | 30.695 | 27.222 | 26.916 | 26.569 |
| 2045-10-01 | 59.17 | 59.17 | 56.248 | 31.091 | 30.695 | 27.222 | 26.917 | 26.568 |
| 2045-11-01 | 59.17 | 59.17 | 56.248 | 31.091 | 30.695 | 27.222 | 26.916 | 26.568 |
| 2045-12-01 | 59.17 | 59.17 | 56.248 | 31.091 | 30.695 | 27.222 | 26.916 | 26.569 |
| 2046-01-01 | 59.17 | 59.17 | 56.248 | 31.09 | 30.695 | 27.222 | 26.918 | 26.567 |
| 2046-02-01 | 59.17 | 59.17 | 56.248 | 31.091 | 30.695 | 27.222 | 26.917 | 26.567 |
| 2046-03-01 | 59.17 | 59.17 | 56.248 | 31.09 | 30.695 | 27.222 | 26.918 | 26.567 |
| 2046-04-01 | 59.17 | 59.17 | 56.248 | 31.09 | 30.695 | 27.222 | 26.917 | 26.567 |
| 2046-05-01 | 59.17 | 59.17 | 56.248 | 31.09 | 30.695 | 27.222 | 26.917 | 26.568 |
| 2046-06-01 | 59.17 | 59.17 | 56.248 | 31.09 | 30.695 | 27.222 | 26.917 | 26.567 |
| 2046-07-01 | 59.17 | 59.17 | 56.248 | 31.091 | 30.695 | 27.222 | 26.916 | 26.568 |
| 2046-08-01 | 59.17 | 59.17 | 56.248 | 31.091 | 30.695 | 27.222 | 26.917 | 26.568 |
| 2046-09-01 | 59.17 | 59.17 | 56.248 | 31.091 | 30.695 | 27.222 | 26.917 | 26.568 |
| 2046-10-01 | 59.17 | 59.17 | 56.248 | 31.091 | 30.695 | 27.222 | 26.917 | 26.568 |
| 2046-11-01 | 59.17 | 59.17 | 56.248 | 31.091 | 30.695 | 27.222 | 26.917 | 26.568 |
| 2046-12-01 | 59.17 | 59.17 | 56.248 | 31.091 | 30.695 | 27.222 | 26.917 | 26.568 |